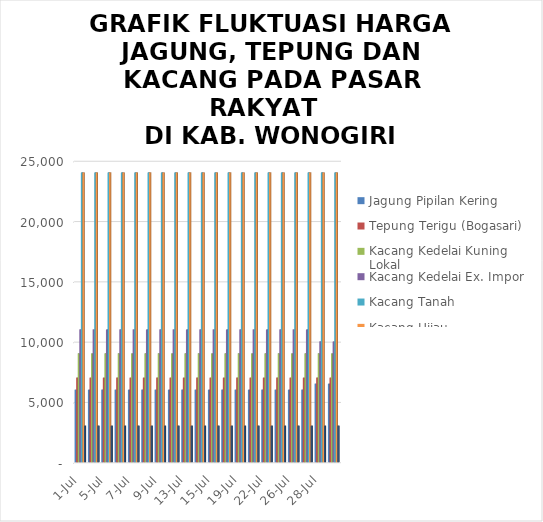
| Category | Jagung Pipilan Kering  | Tepung Terigu (Bogasari) | Kacang Kedelai Kuning Lokal | Kacang Kedelai Ex. Impor | Kacang Tanah | Kacang Hijau | Ketela Pohon |
|---|---|---|---|---|---|---|---|
| 2021-07-01 | 6000 | 7000 | 9000 | 11000 | 24000 | 24000 | 3000 |
| 2021-07-02 | 6000 | 7000 | 9000 | 11000 | 24000 | 24000 | 3000 |
| 2021-07-05 | 6000 | 7000 | 9000 | 11000 | 24000 | 24000 | 3000 |
| 2021-07-06 | 6000 | 7000 | 9000 | 11000 | 24000 | 24000 | 3000 |
| 2021-07-07 | 6000 | 7000 | 9000 | 11000 | 24000 | 24000 | 3000 |
| 2021-07-08 | 6000 | 7000 | 9000 | 11000 | 24000 | 24000 | 3000 |
| 2021-07-09 | 6000 | 7000 | 9000 | 11000 | 24000 | 24000 | 3000 |
| 2021-07-12 | 6000 | 7000 | 9000 | 11000 | 24000 | 24000 | 3000 |
| 2021-07-13 | 6000 | 7000 | 9000 | 11000 | 24000 | 24000 | 3000 |
| 2021-07-14 | 6000 | 7000 | 9000 | 11000 | 24000 | 24000 | 3000 |
| 2021-07-15 | 6000 | 7000 | 9000 | 11000 | 24000 | 24000 | 3000 |
| 2021-07-16 | 6000 | 7000 | 9000 | 11000 | 24000 | 24000 | 3000 |
| 2021-07-19 | 6000 | 7000 | 9000 | 11000 | 24000 | 24000 | 3000 |
| 2021-07-21 | 6000 | 7000 | 9000 | 11000 | 24000 | 24000 | 3000 |
| 2021-07-22 | 6000 | 7000 | 9000 | 11000 | 24000 | 24000 | 3000 |
| 2021-07-23 | 6000 | 7000 | 9000 | 11000 | 24000 | 24000 | 3000 |
| 2021-07-26 | 6000 | 7000 | 9000 | 11000 | 24000 | 24000 | 3000 |
| 2021-07-27 | 6000 | 7000 | 9000 | 11000 | 24000 | 24000 | 3000 |
| 2021-07-28 | 6500 | 7000 | 9000 | 10000 | 24000 | 24000 | 3000 |
| 2021-07-29 | 6500 | 7000 | 9000 | 10000 | 24000 | 24000 | 3000 |